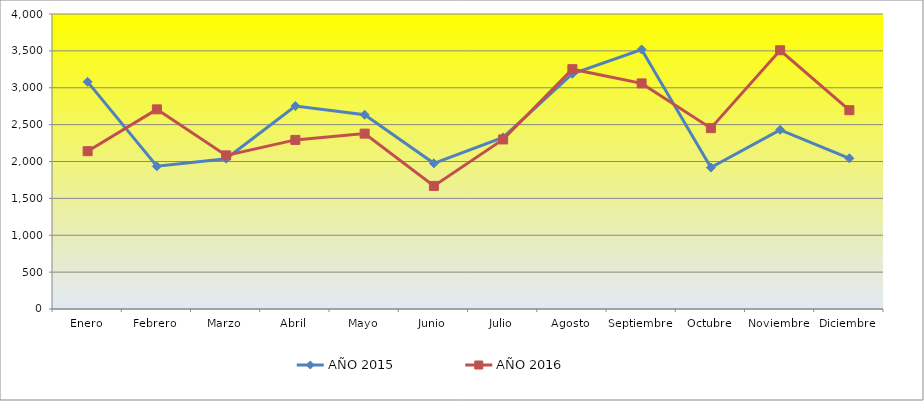
| Category | AÑO 2015 | AÑO 2016 |
|---|---|---|
| Enero | 3080 | 2140 |
| Febrero | 1935 | 2707 |
| Marzo | 2038 | 2083 |
| Abril | 2752 | 2293 |
| Mayo | 2634 | 2378 |
| Junio | 1975 | 1669 |
| Julio | 2327 | 2299 |
| Agosto | 3190 | 3252 |
| Septiembre | 3519 | 3059 |
| Octubre | 1918 | 2452 |
| Noviembre | 2429 | 3508 |
| Diciembre | 2043 | 2696 |